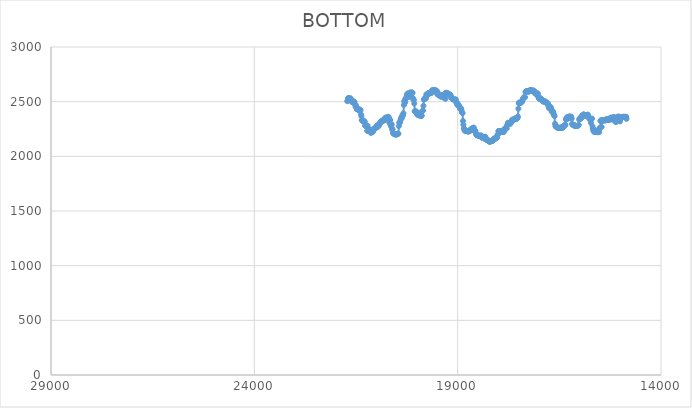
| Category | BOTTOM |
|---|---|
| 14848.1134 | 2342.59 |
| 14855.2471 | 2360.89 |
| 14865.4866 | 2360.89 |
| 14875.7266 | 2360.89 |
| 14885.9666 | 2360.89 |
| 14896.2067 | 2360.89 |
| 14906.4467 | 2360.89 |
| 14916.6867 | 2360.89 |
| 14926.9267 | 2360.89 |
| 14937.1667 | 2360.89 |
| 14947.4068 | 2360.89 |
| 14957.6468 | 2360.11 |
| 14967.8868 | 2352.44 |
| 14978.1268 | 2352.44 |
| 14988.3668 | 2353.22 |
| 14998.6069 | 2356.61 |
| 15008.8469 | 2318.84 |
| 15019.0869 | 2361.78 |
| 15029.3269 | 2356.54 |
| 15039.5669 | 2356.03 |
| 15049.807 | 2363.57 |
| 15060.047 | 2361.65 |
| 15070.287 | 2355.26 |
| 15080.527 | 2355 |
| 15090.767 | 2349.09 |
| 15101.0071 | 2315.85 |
| 15111.2471 | 2315.97 |
| 15121.4871 | 2317.38 |
| 15131.7271 | 2322.26 |
| 15141.9671 | 2357.82 |
| 15152.2072 | 2355 |
| 15162.4472 | 2352.96 |
| 15172.6872 | 2358.07 |
| 15182.9272 | 2356.79 |
| 15193.1672 | 2343.74 |
| 15203.4073 | 2341.31 |
| 15213.6473 | 2342.46 |
| 15223.8873 | 2342.46 |
| 15234.1273 | 2353.34 |
| 15244.3673 | 2335.04 |
| 15254.6074 | 2344.13 |
| 15264.8474 | 2345.28 |
| 15275.0874 | 2342.98 |
| 15285.3274 | 2332.74 |
| 15295.5674 | 2332.74 |
| 15305.8075 | 2332.74 |
| 15316.0475 | 2332.61 |
| 15326.2875 | 2331.46 |
| 15336.5275 | 2333.63 |
| 15346.7675 | 2341.83 |
| 15357.0076 | 2333.64 |
| 15367.2476 | 2328.77 |
| 15377.4876 | 2331.08 |
| 15387.7276 | 2328.51 |
| 15397.9676 | 2328.77 |
| 15408.2077 | 2331.33 |
| 15418.4477 | 2331.33 |
| 15428.6877 | 2331.33 |
| 15438.9277 | 2330.95 |
| 15449.1677 | 2321.29 |
| 15459.4078 | 2268.17 |
| 15469.6478 | 2327.36 |
| 15479.8878 | 2329.92 |
| 15490.1278 | 2323.61 |
| 15500.3678 | 2259.67 |
| 15510.6079 | 2257.29 |
| 15520.8479 | 2222.02 |
| 15531.0879 | 2240.49 |
| 15541.3279 | 2233.05 |
| 15551.5679 | 2234.1 |
| 15561.808 | 2219.73 |
| 15572.048 | 2229.35 |
| 15582.288 | 2223.95 |
| 15592.528 | 2234.2 |
| 15602.768 | 2233.2 |
| 15613.0081 | 2222.82 |
| 15623.2481 | 2221.66 |
| 15633.4881 | 2224.95 |
| 15643.7281 | 2243.59 |
| 15653.9681 | 2225.73 |
| 15664.2082 | 2240.58 |
| 15674.4482 | 2250.03 |
| 15684.6882 | 2274.85 |
| 15694.9282 | 2345.16 |
| 15705.1682 | 2342.59 |
| 15715.4083 | 2339.1 |
| 15725.6483 | 2306.54 |
| 15735.8883 | 2341.18 |
| 15746.1283 | 2341.18 |
| 15756.3683 | 2342.05 |
| 15766.6084 | 2351.28 |
| 15776.8484 | 2353.98 |
| 15787.0884 | 2357.62 |
| 15797.3284 | 2381.76 |
| 15807.5684 | 2379.19 |
| 15817.8085 | 2379.06 |
| 15828.0485 | 2377.66 |
| 15838.2885 | 2376.62 |
| 15848.5285 | 2378.45 |
| 15858.7685 | 2371.11 |
| 15869.0086 | 2374.84 |
| 15879.2486 | 2373.43 |
| 15889.4886 | 2373.38 |
| 15899.7286 | 2384.62 |
| 15909.9686 | 2367.93 |
| 15920.2087 | 2367.93 |
| 15930.4487 | 2368.67 |
| 15940.6887 | 2375.63 |
| 15950.9287 | 2366.2 |
| 15961.1687 | 2348.1 |
| 15971.4088 | 2346.69 |
| 15981.6488 | 2345.65 |
| 15991.8888 | 2347.97 |
| 16002.1288 | 2344.91 |
| 16012.3688 | 2335.12 |
| 16022.6089 | 2286.16 |
| 16032.8489 | 2284.39 |
| 16043.0889 | 2279.25 |
| 16053.3289 | 2279.12 |
| 16063.5689 | 2277.84 |
| 16073.809 | 2277.84 |
| 16084.049 | 2277.72 |
| 16094.289 | 2276.43 |
| 16104.529 | 2276.43 |
| 16114.769 | 2277.29 |
| 16125.0091 | 2285.92 |
| 16135.2491 | 2282.43 |
| 16145.4891 | 2286.16 |
| 16155.7291 | 2285.24 |
| 16165.9691 | 2289.1 |
| 16176.2092 | 2289.34 |
| 16186.4492 | 2296.29 |
| 16196.6892 | 2344.41 |
| 16206.9292 | 2363.22 |
| 16217.1692 | 2358.19 |
| 16227.4093 | 2359.24 |
| 16237.6493 | 2357.51 |
| 16247.8893 | 2366.04 |
| 16258.1293 | 2360.89 |
| 16268.3693 | 2359.56 |
| 16278.6094 | 2346.37 |
| 16288.8494 | 2356.55 |
| 16299.0894 | 2354.05 |
| 16309.3294 | 2342.51 |
| 16319.5694 | 2355.34 |
| 16329.8095 | 2341.3 |
| 16340.0495 | 2337.9 |
| 16350.2895 | 2287.69 |
| 16360.5295 | 2287.57 |
| 16370.7695 | 2285.56 |
| 16381.0096 | 2277.84 |
| 16391.2496 | 2277.12 |
| 16401.4896 | 2268.79 |
| 16411.7296 | 2262.24 |
| 16421.9696 | 2260.95 |
| 16432.2097 | 2260.95 |
| 16442.4497 | 2261.43 |
| 16452.6897 | 2266.22 |
| 16462.9297 | 2262.36 |
| 16473.1697 | 2262.12 |
| 16483.4098 | 2259.54 |
| 16493.6498 | 2259.42 |
| 16503.8898 | 2258.13 |
| 16514.1298 | 2258.61 |
| 16524.3698 | 2263.76 |
| 16534.6099 | 2263.76 |
| 16544.8499 | 2263.76 |
| 16555.0899 | 2263.88 |
| 16565.3299 | 2265.65 |
| 16575.5699 | 2270.8 |
| 16585.81 | 2271.28 |
| 16596.05 | 2277.74 |
| 16606.29 | 2298.2 |
| 16616.53 | 2367.35 |
| 16626.77 | 2376.49 |
| 16637.0101 | 2379.32 |
| 16647.2501 | 2397.14 |
| 16657.4901 | 2408.63 |
| 16667.7301 | 2408.52 |
| 16677.9701 | 2420.24 |
| 16688.2102 | 2409.35 |
| 16698.4502 | 2432.21 |
| 16708.6902 | 2443.47 |
| 16718.9302 | 2453.91 |
| 16729.1702 | 2453.91 |
| 16739.4103 | 2439.72 |
| 16749.6503 | 2440.19 |
| 16759.8903 | 2446.76 |
| 16770.1303 | 2464 |
| 16780.3703 | 2483.47 |
| 16790.6104 | 2484.76 |
| 16800.8504 | 2485.46 |
| 16811.0904 | 2493.09 |
| 16821.3304 | 2491.68 |
| 16831.5704 | 2491.44 |
| 16841.8105 | 2502.82 |
| 16852.0505 | 2500.24 |
| 16862.2905 | 2500.36 |
| 16872.5305 | 2501.65 |
| 16882.7705 | 2501.88 |
| 16893.0106 | 2504.12 |
| 16903.2506 | 2501.06 |
| 16913.4906 | 2510.1 |
| 16923.7306 | 2510.1 |
| 16933.9706 | 2511.37 |
| 16944.2107 | 2525.93 |
| 16954.4507 | 2529.69 |
| 16964.6907 | 2528.4 |
| 16974.9307 | 2528.16 |
| 16985.1707 | 2525.7 |
| 16995.4108 | 2527.22 |
| 17005.6508 | 2530.61 |
| 17015.8908 | 2542.43 |
| 17026.1308 | 2573.09 |
| 17036.3708 | 2569.91 |
| 17046.6109 | 2577.43 |
| 17056.8509 | 2574.5 |
| 17067.0909 | 2570.62 |
| 17077.3309 | 2570.97 |
| 17087.5709 | 2574.96 |
| 17097.811 | 2577.52 |
| 17108.051 | 2591.74 |
| 17118.291 | 2592.54 |
| 17128.531 | 2601.48 |
| 17138.771 | 2600.18 |
| 17149.0111 | 2599.95 |
| 17159.2511 | 2597.6 |
| 17169.4911 | 2600.3 |
| 17179.7311 | 2601.59 |
| 17189.9711 | 2601.93 |
| 17200.2112 | 2605.81 |
| 17210.4512 | 2605.93 |
| 17220.6912 | 2606.31 |
| 17230.9312 | 2595.96 |
| 17241.1712 | 2595.85 |
| 17251.4113 | 2594.33 |
| 17261.6513 | 2591.97 |
| 17271.8913 | 2594.55 |
| 17282.1313 | 2594.55 |
| 17292.3713 | 2594.44 |
| 17302.6114 | 2593.37 |
| 17312.8514 | 2595.73 |
| 17323.0914 | 2593.15 |
| 17333.3314 | 2588.95 |
| 17343.5714 | 2541.06 |
| 17353.8115 | 2541.06 |
| 17364.0515 | 2541.06 |
| 17374.2915 | 2540.16 |
| 17384.5315 | 2529.69 |
| 17394.7715 | 2527.26 |
| 17405.0116 | 2513.19 |
| 17415.2516 | 2499.9 |
| 17425.4916 | 2495.79 |
| 17435.7316 | 2493.2 |
| 17445.9716 | 2492.87 |
| 17456.2117 | 2488.87 |
| 17466.4517 | 2488.14 |
| 17476.6917 | 2493.82 |
| 17486.9317 | 2485.32 |
| 17497.1717 | 2487.86 |
| 17507.4118 | 2436.35 |
| 17517.6518 | 2363.99 |
| 17527.8918 | 2350.7 |
| 17538.1318 | 2346.81 |
| 17548.3718 | 2346.48 |
| 17558.6119 | 2342.48 |
| 17568.8519 | 2341.29 |
| 17579.0919 | 2343.04 |
| 17589.3319 | 2347.77 |
| 17599.5719 | 2342.48 |
| 17609.812 | 2340.74 |
| 17620.052 | 2335.55 |
| 17630.292 | 2335.33 |
| 17640.532 | 2332.96 |
| 17650.7721 | 2335.55 |
| 17661.0121 | 2333.99 |
| 17671.2521 | 2315.96 |
| 17681.4921 | 2317.36 |
| 17691.7321 | 2317 |
| 17701.9722 | 2297.88 |
| 17712.2122 | 2301.66 |
| 17722.4522 | 2300.25 |
| 17732.6922 | 2298.73 |
| 17742.9322 | 2296.14 |
| 17753.1723 | 2297.13 |
| 17763.4123 | 2307.15 |
| 17773.6523 | 2287.69 |
| 17783.8923 | 2285.26 |
| 17794.1323 | 2256.62 |
| 17804.3724 | 2255.21 |
| 17814.6124 | 2253.47 |
| 17824.8524 | 2248.83 |
| 17835.0924 | 2254.99 |
| 17845.3324 | 2251.09 |
| 17855.5725 | 2248.79 |
| 17865.8125 | 2221.97 |
| 17876.0525 | 2227.17 |
| 17886.2925 | 2226.84 |
| 17896.5325 | 2222.94 |
| 17906.7726 | 2223.27 |
| 17917.0126 | 2226.73 |
| 17927.2526 | 2221.97 |
| 17937.4926 | 2227.38 |
| 17947.7326 | 2229.98 |
| 17957.9727 | 2229.87 |
| 17968.2127 | 2228.9 |
| 17978.4527 | 2232.69 |
| 17988.6927 | 2231.5 |
| 17998.9327 | 2230.18 |
| 18009.1728 | 2199.01 |
| 18019.4128 | 2197.06 |
| 18029.6528 | 2173.57 |
| 18039.8928 | 2172.05 |
| 18050.1328 | 2169.02 |
| 18060.3729 | 2163.82 |
| 18070.6129 | 2163.61 |
| 18080.8529 | 2161.01 |
| 18091.0929 | 2161.12 |
| 18101.3329 | 2162.42 |
| 18111.573 | 2161.23 |
| 18121.813 | 2146.72 |
| 18132.053 | 2143.9 |
| 18142.293 | 2141.3 |
| 18152.533 | 2141.41 |
| 18162.7731 | 2142.39 |
| 18173.0131 | 2138.49 |
| 18183.2531 | 2138.49 |
| 18193.4931 | 2138.06 |
| 18203.7331 | 2132.96 |
| 18213.9732 | 2134.48 |
| 18224.2132 | 2137.08 |
| 18234.4532 | 2137.19 |
| 18244.6932 | 2139.34 |
| 18254.9332 | 2149.64 |
| 18265.1733 | 2148.66 |
| 18275.4133 | 2152.56 |
| 18285.6533 | 2152.56 |
| 18295.8933 | 2152.56 |
| 18306.1333 | 2154.7 |
| 18316.3734 | 2178.79 |
| 18326.6134 | 2157.08 |
| 18336.8534 | 2177.79 |
| 18347.0934 | 2176.38 |
| 18357.3334 | 2175.08 |
| 18367.5735 | 2174.98 |
| 18377.8135 | 2173.78 |
| 18388.0535 | 2175.61 |
| 18398.2935 | 2181.17 |
| 18408.5335 | 2171.15 |
| 18418.7736 | 2191.02 |
| 18429.0136 | 2180.05 |
| 18439.2536 | 2188.95 |
| 18449.4936 | 2186.45 |
| 18459.7336 | 2187.65 |
| 18469.9737 | 2186.56 |
| 18480.2137 | 2189.16 |
| 18490.4537 | 2189.48 |
| 18500.6937 | 2193.28 |
| 18510.9337 | 2191.97 |
| 18521.1738 | 2192.29 |
| 18531.4138 | 2196.2 |
| 18541.6538 | 2196.83 |
| 18551.8938 | 2206.75 |
| 18562.1338 | 2232.9 |
| 18572.3739 | 2233.99 |
| 18582.6139 | 2231.91 |
| 18592.8539 | 2240.31 |
| 18603.0939 | 2263.34 |
| 18613.3339 | 2258.13 |
| 18623.574 | 2258.03 |
| 18633.814 | 2256.41 |
| 18644.054 | 2251.88 |
| 18654.294 | 2244.37 |
| 18664.534 | 2248.28 |
| 18674.7741 | 2247.97 |
| 18685.0141 | 2243.12 |
| 18695.2541 | 2231.91 |
| 18705.4941 | 2237.91 |
| 18715.7341 | 2231.18 |
| 18725.9742 | 2228.47 |
| 18736.2142 | 2227.17 |
| 18746.4542 | 2227.27 |
| 18756.6942 | 2228.68 |
| 18766.9342 | 2230.19 |
| 18777.1743 | 2232.8 |
| 18787.4143 | 2233 |
| 18797.6543 | 2235.2 |
| 18807.8943 | 2230.29 |
| 18818.1344 | 2234.2 |
| 18828.3744 | 2235.44 |
| 18838.6144 | 2251.09 |
| 18848.8544 | 2253.67 |
| 18859.0944 | 2288.55 |
| 18869.3345 | 2322.91 |
| 18879.5745 | 2394.98 |
| 18889.8145 | 2399.51 |
| 18900.0545 | 2408.77 |
| 18910.2945 | 2428.06 |
| 18920.5346 | 2440.72 |
| 18930.7746 | 2435.49 |
| 18941.0146 | 2436.5 |
| 18951.2546 | 2450.37 |
| 18961.4946 | 2460.63 |
| 18971.7347 | 2458.51 |
| 18981.9747 | 2466.04 |
| 18992.2147 | 2478.83 |
| 19002.4547 | 2474.61 |
| 19012.6947 | 2472.25 |
| 19022.9348 | 2493.01 |
| 19033.1748 | 2492.43 |
| 19043.4148 | 2519.85 |
| 19053.6548 | 2518.54 |
| 19063.8948 | 2518.54 |
| 19074.1349 | 2518.54 |
| 19084.3749 | 2518.64 |
| 19094.6149 | 2519.95 |
| 19104.8549 | 2520.04 |
| 19115.0949 | 2521.55 |
| 19125.335 | 2524.36 |
| 19135.575 | 2527.27 |
| 19145.815 | 2531.3 |
| 19156.055 | 2533.92 |
| 19166.295 | 2552.51 |
| 19176.5351 | 2555.88 |
| 19186.7751 | 2566.31 |
| 19197.0151 | 2564.99 |
| 19207.2551 | 2564.99 |
| 19217.4951 | 2565.08 |
| 19227.7352 | 2567.03 |
| 19237.9752 | 2575.71 |
| 19248.2152 | 2568.52 |
| 19258.4552 | 2579.07 |
| 19268.6952 | 2579.16 |
| 19278.9353 | 2580.74 |
| 19289.1753 | 2580.83 |
| 19299.4153 | 2525.92 |
| 19309.6553 | 2573.44 |
| 19319.8953 | 2572.83 |
| 19330.1354 | 2561.85 |
| 19340.3754 | 2535.86 |
| 19350.6154 | 2543.67 |
| 19360.8554 | 2561.84 |
| 19371.0954 | 2556.29 |
| 19381.3355 | 2552.58 |
| 19391.5755 | 2556.29 |
| 19401.8155 | 2551.82 |
| 19412.0555 | 2544.3 |
| 19422.2955 | 2551.33 |
| 19432.5356 | 2557.71 |
| 19442.7756 | 2554.31 |
| 19453.0156 | 2563.34 |
| 19463.2556 | 2559.36 |
| 19473.4956 | 2559.61 |
| 19483.7357 | 2564.88 |
| 19493.9757 | 2585.06 |
| 19504.2157 | 2569.65 |
| 19514.4557 | 2599.78 |
| 19524.6957 | 2593.54 |
| 19534.9358 | 2599.95 |
| 19545.1758 | 2596.51 |
| 19555.4158 | 2605.74 |
| 19565.6558 | 2604.25 |
| 19575.8958 | 2601.67 |
| 19586.1359 | 2603 |
| 19596.3759 | 2603 |
| 19606.6159 | 2603 |
| 19616.8559 | 2603 |
| 19627.096 | 2603 |
| 19637.336 | 2601.72 |
| 19647.576 | 2579.07 |
| 19657.816 | 2579.07 |
| 19668.056 | 2579.14 |
| 19678.2961 | 2580.18 |
| 19688.5361 | 2575.14 |
| 19698.7761 | 2580.48 |
| 19709.0161 | 2580.4 |
| 19719.2561 | 2578.42 |
| 19729.4962 | 2566.18 |
| 19739.7362 | 2562.18 |
| 19749.9762 | 2562.39 |
| 19760.2162 | 2566.47 |
| 19770.4562 | 2565.83 |
| 19780.6963 | 2528.68 |
| 19790.9363 | 2533.96 |
| 19801.1763 | 2532.55 |
| 19811.4163 | 2530.8 |
| 19821.6563 | 2522.7 |
| 19831.8964 | 2518.55 |
| 19842.1364 | 2461.47 |
| 19852.3764 | 2418.53 |
| 19862.6164 | 2417.13 |
| 19872.8564 | 2413.71 |
| 19883.0965 | 2372.08 |
| 19893.3365 | 2370.74 |
| 19903.5765 | 2370.74 |
| 19913.8165 | 2370.74 |
| 19924.0565 | 2371.46 |
| 19934.2966 | 2385.84 |
| 19944.5366 | 2377.65 |
| 19954.7766 | 2375.03 |
| 19965.0166 | 2376.44 |
| 19975.2566 | 2378.35 |
| 19985.4967 | 2390.13 |
| 19995.7367 | 2384.04 |
| 20005.9767 | 2398.11 |
| 20016.2167 | 2411.13 |
| 20026.4567 | 2402.14 |
| 20036.6968 | 2411.44 |
| 20046.9368 | 2408.81 |
| 20057.1768 | 2413.17 |
| 20067.4168 | 2482.03 |
| 20077.6568 | 2515.73 |
| 20087.8969 | 2516.32 |
| 20098.1369 | 2531.92 |
| 20108.3769 | 2580.59 |
| 20118.6169 | 2583.29 |
| 20128.8569 | 2583.29 |
| 20139.097 | 2583.06 |
| 20149.337 | 2577.95 |
| 20159.577 | 2584.47 |
| 20169.817 | 2577.95 |
| 20180.057 | 2550.75 |
| 20190.2971 | 2546.64 |
| 20200.5371 | 2545.29 |
| 20210.7771 | 2546.43 |
| 20221.0171 | 2574.85 |
| 20231.2571 | 2574.36 |
| 20241.4972 | 2562.18 |
| 20251.7372 | 2561.22 |
| 20261.9772 | 2536.52 |
| 20272.2172 | 2528.4 |
| 20282.4573 | 2526.99 |
| 20292.6973 | 2491.16 |
| 20302.9373 | 2511.14 |
| 20313.1773 | 2500.58 |
| 20323.4173 | 2469.31 |
| 20333.6574 | 2394.17 |
| 20343.8974 | 2380.1 |
| 20354.1374 | 2366.72 |
| 20364.3774 | 2371.32 |
| 20374.6174 | 2348.46 |
| 20384.8575 | 2354.97 |
| 20395.0975 | 2346.33 |
| 20405.3375 | 2332.07 |
| 20415.5775 | 2312.89 |
| 20425.8175 | 2308.81 |
| 20436.0576 | 2307.83 |
| 20446.2976 | 2276.9 |
| 20456.5376 | 2207.41 |
| 20466.7776 | 2206.01 |
| 20477.0176 | 2204.55 |
| 20487.2577 | 2201.83 |
| 20497.4977 | 2201.78 |
| 20507.7377 | 2200.42 |
| 20517.9777 | 2200.42 |
| 20528.2177 | 2200.51 |
| 20538.4578 | 2203.15 |
| 20548.6978 | 2200.59 |
| 20558.9378 | 2206.05 |
| 20569.1778 | 2206.3 |
| 20579.4178 | 2214.33 |
| 20589.6579 | 2210.01 |
| 20599.8979 | 2248.12 |
| 20610.1379 | 2244.06 |
| 20620.3779 | 2291.24 |
| 20630.6179 | 2268.81 |
| 20640.858 | 2297.23 |
| 20651.098 | 2287.56 |
| 20661.338 | 2332.74 |
| 20671.578 | 2332.05 |
| 20681.818 | 2308.6 |
| 20692.0581 | 2352.7 |
| 20702.2981 | 2362 |
| 20712.5381 | 2351.04 |
| 20722.7781 | 2351.18 |
| 20733.0181 | 2356.59 |
| 20743.2582 | 2353.85 |
| 20753.4982 | 2353.82 |
| 20763.7382 | 2352.48 |
| 20773.9782 | 2353.78 |
| 20784.2182 | 2350.56 |
| 20794.4583 | 2331.3 |
| 20804.6983 | 2329.92 |
| 20814.9383 | 2329.95 |
| 20825.1783 | 2331.2 |
| 20835.4183 | 2325.67 |
| 20845.6584 | 2324.29 |
| 20855.8984 | 2324.35 |
| 20866.1384 | 2326.77 |
| 20876.3784 | 2311.65 |
| 20886.6185 | 2313.12 |
| 20896.8585 | 2316.9 |
| 20907.0985 | 2300.3 |
| 20917.3385 | 2297.34 |
| 20927.5785 | 2287.84 |
| 20937.8186 | 2294.31 |
| 20948.0586 | 2273.62 |
| 20958.2986 | 2273.84 |
| 20968.5386 | 2284.55 |
| 20978.7786 | 2267.93 |
| 20989.0187 | 2265.41 |
| 20999.2587 | 2277.58 |
| 21009.4987 | 2263.66 |
| 21019.7387 | 2258.06 |
| 21029.9787 | 2253.91 |
| 21040.2188 | 2253.86 |
| 21050.4588 | 2251.07 |
| 21060.6988 | 2249.69 |
| 21070.9388 | 2249.31 |
| 21081.1788 | 2227.07 |
| 21091.4189 | 2221.74 |
| 21101.6589 | 2234.2 |
| 21111.8989 | 2234.16 |
| 21122.1389 | 2231.11 |
| 21132.3789 | 2213.56 |
| 21142.619 | 2243.95 |
| 21152.859 | 2237.08 |
| 21163.099 | 2241.08 |
| 21173.339 | 2230.12 |
| 21183.579 | 2239.83 |
| 21193.8191 | 2239.72 |
| 21204.0591 | 2232.04 |
| 21214.2991 | 2280.03 |
| 21224.5391 | 2233.42 |
| 21234.7791 | 2281.94 |
| 21245.0192 | 2272.29 |
| 21255.2592 | 2279.26 |
| 21265.4992 | 2280.64 |
| 21275.7392 | 2279.68 |
| 21285.9792 | 2317.3 |
| 21296.2193 | 2321.41 |
| 21306.4593 | 2315.9 |
| 21316.6993 | 2321.48 |
| 21326.9393 | 2321.59 |
| 21337.1793 | 2332.74 |
| 21347.4194 | 2332.7 |
| 21357.6594 | 2328.87 |
| 21367.8994 | 2366.66 |
| 21378.1394 | 2382.32 |
| 21388.3795 | 2418.67 |
| 21398.6195 | 2427.04 |
| 21408.8595 | 2425.63 |
| 21419.0995 | 2424.19 |
| 21429.3395 | 2418.72 |
| 21439.5796 | 2434.08 |
| 21449.8196 | 2434.06 |
| 21460.0596 | 2429.87 |
| 21470.2996 | 2431.27 |
| 21480.5396 | 2431.38 |
| 21490.7797 | 2449.67 |
| 21501.0197 | 2466.39 |
| 21511.2597 | 2453.92 |
| 21521.4997 | 2477.72 |
| 21531.7397 | 2477.83 |
| 21541.9798 | 2500.24 |
| 21552.2198 | 2500.24 |
| 21562.4598 | 2500.25 |
| 21572.6998 | 2501.65 |
| 21582.9398 | 2501.63 |
| 21593.1799 | 2496.03 |
| 21603.4199 | 2498.88 |
| 21613.6599 | 2512.93 |
| 21623.8999 | 2518.57 |
| 21634.1399 | 2531.19 |
| 21644.38 | 2521.36 |
| 21654.62 | 2522.78 |
| 21664.86 | 2529.8 |
| 21675.1 | 2531.21 |
| 21685.34 | 2531.21 |
| 21695.5801 | 2531.2 |
| 21705.8201 | 2508.69 |
| 21714.5796 | 2504.47 |